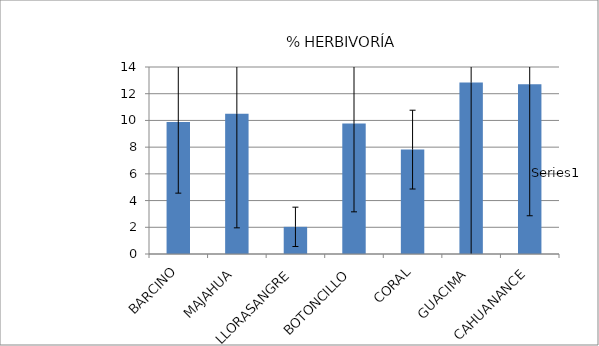
| Category | Series 0 |
|---|---|
| BARCINO | 9.884 |
| MAJAHUA | 10.496 |
| LLORASANGRE | 2.033 |
| BOTONCILLO | 9.778 |
| CORAL | 7.816 |
| GUACIMA | 12.845 |
| CAHUANANCE | 12.706 |